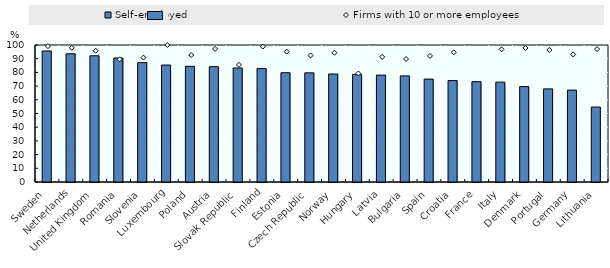
| Category | Self-employed |
|---|---|
| Sweden | 95.65 |
| Netherlands | 93.58 |
| United Kingdom | 92.12 |
| Romania | 90.49 |
| Slovenia | 87.14 |
| Luxembourg | 85.35 |
| Poland | 84.46 |
| Austria | 84.21 |
| Slovak Republic | 83.22 |
| Finland | 82.89 |
| Estonia | 79.76 |
| Czech Republic | 79.68 |
| Norway | 78.84 |
| Hungary | 78.55 |
| Latvia | 78.02 |
| Bulgaria | 77.46 |
| Spain | 75.11 |
| Croatia | 74.03 |
| France | 73.24 |
| Italy | 72.9 |
| Denmark | 69.64 |
| Portugal | 67.97 |
| Germany | 67.07 |
| Lithuania | 54.7 |